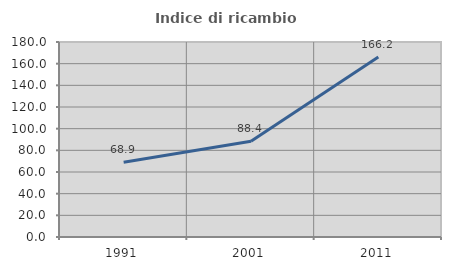
| Category | Indice di ricambio occupazionale  |
|---|---|
| 1991.0 | 68.911 |
| 2001.0 | 88.45 |
| 2011.0 | 166.17 |